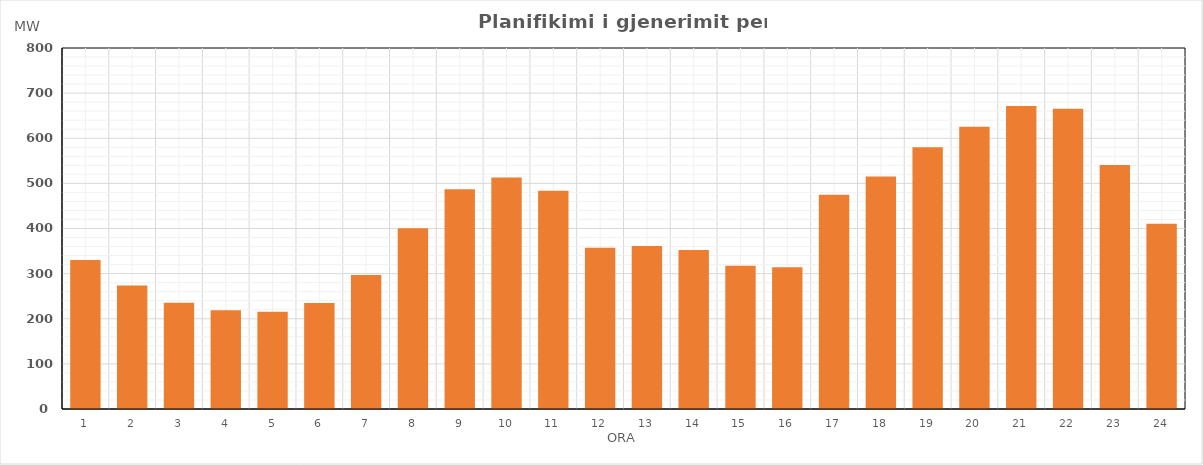
| Category | Max (MW) |
|---|---|
| 0 | 330.19 |
| 1 | 273.89 |
| 2 | 235.47 |
| 3 | 218.58 |
| 4 | 215.55 |
| 5 | 234.88 |
| 6 | 296.95 |
| 7 | 400.46 |
| 8 | 487.16 |
| 9 | 513.06 |
| 10 | 483.45 |
| 11 | 357.31 |
| 12 | 361.04 |
| 13 | 352.31 |
| 14 | 317.53 |
| 15 | 314.09 |
| 16 | 474.86 |
| 17 | 515.46 |
| 18 | 579.91 |
| 19 | 625.21 |
| 20 | 671.69 |
| 21 | 665.38 |
| 22 | 540.52 |
| 23 | 410.8 |